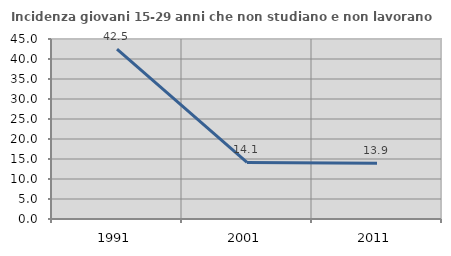
| Category | Incidenza giovani 15-29 anni che non studiano e non lavorano  |
|---|---|
| 1991.0 | 42.466 |
| 2001.0 | 14.13 |
| 2011.0 | 13.923 |